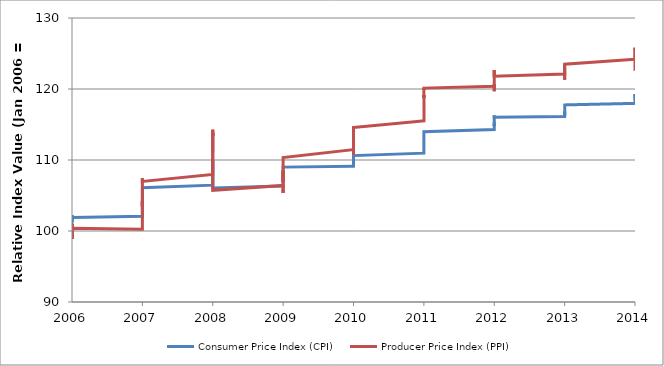
| Category | Consumer Price Index (CPI) | Producer Price Index (PPI) |
|---|---|---|
| 2006-01-01 | 100 | 100 |
| 2006-02-01 | 100.05 | 98.879 |
| 2006-03-01 | 100.201 | 99.252 |
| 2006-04-01 | 100.702 | 100.062 |
| 2006-05-01 | 101.004 | 100.062 |
| 2006-06-01 | 101.254 | 100.561 |
| 2006-07-01 | 101.806 | 100.312 |
| 2006-08-01 | 102.258 | 100.997 |
| 2006-09-01 | 101.756 | 99.813 |
| 2006-10-01 | 101.305 | 98.879 |
| 2006-11-01 | 101.355 | 99.688 |
| 2006-12-01 | 101.907 | 100.374 |
| 2007-01-01 | 102.076 | 100.249 |
| 2007-02-01 | 102.472 | 101.371 |
| 2007-03-01 | 103.005 | 102.243 |
| 2007-04-01 | 103.314 | 102.991 |
| 2007-05-01 | 103.741 | 103.427 |
| 2007-06-01 | 103.981 | 103.489 |
| 2007-07-01 | 104.166 | 104.174 |
| 2007-08-01 | 104.198 | 103.427 |
| 2007-09-01 | 104.64 | 104.424 |
| 2007-10-01 | 104.962 | 105.483 |
| 2007-11-01 | 105.787 | 107.414 |
| 2007-12-01 | 106.094 | 106.978 |
| 2008-01-01 | 106.46 | 107.975 |
| 2008-02-01 | 106.717 | 108.349 |
| 2008-03-01 | 107.099 | 109.283 |
| 2008-04-01 | 107.347 | 109.595 |
| 2008-05-01 | 107.982 | 111.153 |
| 2008-06-01 | 109.113 | 112.897 |
| 2008-07-01 | 109.893 | 114.268 |
| 2008-08-01 | 109.729 | 113.396 |
| 2008-09-01 | 109.823 | 113.832 |
| 2008-10-01 | 108.879 | 111.09 |
| 2008-11-01 | 106.951 | 107.726 |
| 2008-12-01 | 106.07 | 105.732 |
| 2009-01-01 | 106.339 | 106.417 |
| 2009-02-01 | 106.726 | 106.293 |
| 2009-03-01 | 106.621 | 105.358 |
| 2009-04-01 | 106.728 | 105.919 |
| 2009-05-01 | 106.885 | 106.106 |
| 2009-06-01 | 107.772 | 108.1 |
| 2009-07-01 | 107.74 | 106.854 |
| 2009-08-01 | 108.101 | 108.349 |
| 2009-09-01 | 108.31 | 108.1 |
| 2009-10-01 | 108.635 | 108.598 |
| 2009-11-01 | 108.998 | 110.031 |
| 2009-12-01 | 109.055 | 110.343 |
| 2010-01-01 | 109.126 | 111.464 |
| 2010-02-01 | 109.022 | 110.717 |
| 2010-03-01 | 109.058 | 111.464 |
| 2010-04-01 | 109.083 | 111.464 |
| 2010-05-01 | 109.027 | 111.464 |
| 2010-06-01 | 108.981 | 111.09 |
| 2010-07-01 | 109.185 | 111.215 |
| 2010-08-01 | 109.344 | 111.776 |
| 2010-09-01 | 109.521 | 112.212 |
| 2010-10-01 | 109.902 | 113.146 |
| 2010-11-01 | 110.181 | 113.645 |
| 2010-12-01 | 110.623 | 114.579 |
| 2011-01-01 | 110.962 | 115.514 |
| 2011-02-01 | 111.342 | 116.698 |
| 2011-03-01 | 111.914 | 117.508 |
| 2011-04-01 | 112.423 | 118.505 |
| 2011-05-01 | 112.829 | 119.128 |
| 2011-06-01 | 112.815 | 118.754 |
| 2011-07-01 | 113.105 | 119.19 |
| 2011-08-01 | 113.438 | 119.065 |
| 2011-09-01 | 113.736 | 120.062 |
| 2011-10-01 | 113.804 | 119.875 |
| 2011-11-01 | 113.977 | 120.125 |
| 2011-12-01 | 113.971 | 120 |
| 2012-01-01 | 114.279 | 120.374 |
| 2012-02-01 | 114.543 | 120.685 |
| 2012-03-01 | 114.835 | 120.81 |
| 2012-04-01 | 114.988 | 120.561 |
| 2012-05-01 | 114.794 | 120.062 |
| 2012-06-01 | 114.715 | 119.688 |
| 2012-07-01 | 114.693 | 119.875 |
| 2012-08-01 | 115.359 | 121.308 |
| 2012-09-01 | 115.958 | 122.492 |
| 2012-10-01 | 116.277 | 122.679 |
| 2012-11-01 | 116.007 | 121.807 |
| 2012-12-01 | 115.988 | 121.682 |
| 2013-01-01 | 116.128 | 122.118 |
| 2013-02-01 | 116.81 | 122.804 |
| 2013-03-01 | 116.53 | 122.181 |
| 2013-04-01 | 116.243 | 121.308 |
| 2013-05-01 | 116.402 | 122.181 |
| 2013-06-01 | 116.7 | 122.368 |
| 2013-07-01 | 116.899 | 122.368 |
| 2013-08-01 | 117.116 | 122.741 |
| 2013-09-01 | 117.297 | 122.741 |
| 2013-10-01 | 117.362 | 122.991 |
| 2013-11-01 | 117.43 | 122.804 |
| 2013-12-01 | 117.761 | 123.489 |
| 2014-01-01 | 117.977 | 124.174 |
| 2014-02-01 | 118.091 | 124.299 |
| 2014-03-01 | 118.309 | 124.611 |
| 2014-04-01 | 118.535 | 125.109 |
| 2014-05-01 | 118.891 | 125.296 |
| 2014-06-01 | 119.091 | 125.794 |
| 2014-07-01 | 119.215 | 125.732 |
| 2014-08-01 | 119.121 | 125.545 |
| 2014-09-01 | 119.23 | 125.421 |
| 2014-10-01 | 119.294 | 125.109 |
| 2014-11-01 | 118.95 | 124.112 |
| 2014-12-01 | 118.557 | 122.555 |